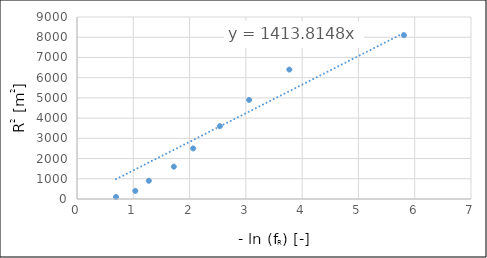
| Category | Series 0 |
|---|---|
| 0.6931471805599453 | 100 |
| 1.0356374895067213 | 400 |
| 1.2765434971607714 | 900 |
| 1.7203694731413819 | 1600 |
| 2.0635681925235456 | 2500 |
| 2.538307426515115 | 3600 |
| 3.0576076772720775 | 4900 |
| 3.7722610630529863 | 6400 |
| 5.809142990314027 | 8100 |